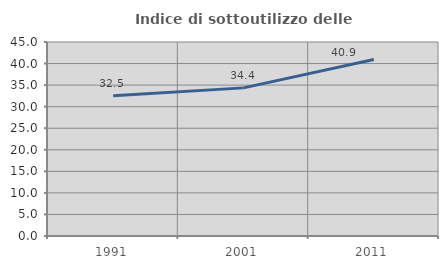
| Category | Indice di sottoutilizzo delle abitazioni  |
|---|---|
| 1991.0 | 32.514 |
| 2001.0 | 34.36 |
| 2011.0 | 40.927 |